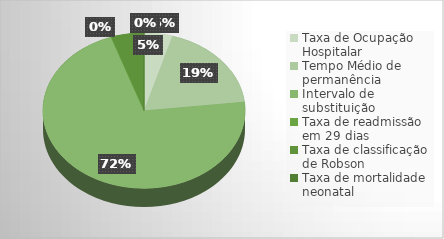
| Category | Series 0 |
|---|---|
| Taxa de Ocupação Hospitalar | 0.862 |
| Tempo Médio de permanência | 3.54 |
| Intervalo de substituição | 13.6 |
| Taxa de readmissão em 29 dias | 0 |
| Taxa de classificação de Robson | 1 |
| Taxa de mortalidade neonatal | 0 |